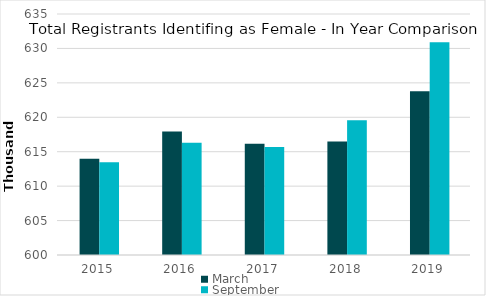
| Category | March | September |
|---|---|---|
| 2015-03-31 | 613991 | 613486 |
| 2016-03-31 | 617919 | 616306 |
| 2017-03-31 | 616171 | 615701 |
| 2018-03-31 | 616492 | 619587 |
| 2019-03-31 | 623779 | 630891 |